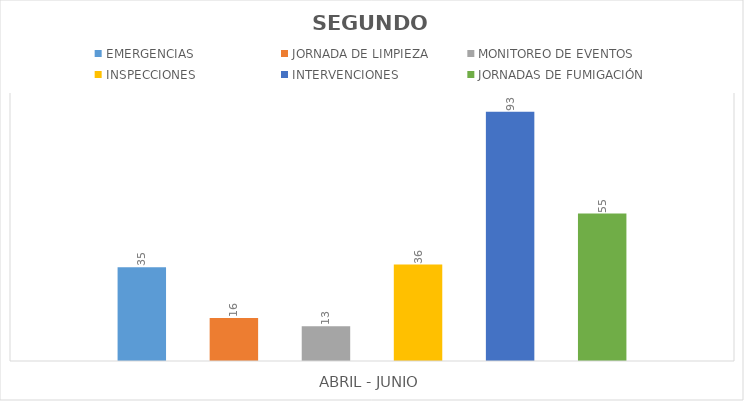
| Category | EMERGENCIAS  | JORNADA DE LIMPIEZA | MONITOREO DE EVENTOS  | INSPECCIONES | INTERVENCIONES | JORNADAS DE FUMIGACIÓN |
|---|---|---|---|---|---|---|
| 0 | 35 | 16 | 13 | 36 | 93 | 55 |